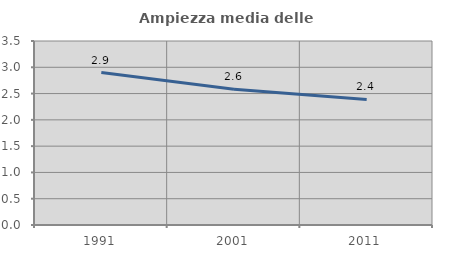
| Category | Ampiezza media delle famiglie |
|---|---|
| 1991.0 | 2.899 |
| 2001.0 | 2.583 |
| 2011.0 | 2.389 |